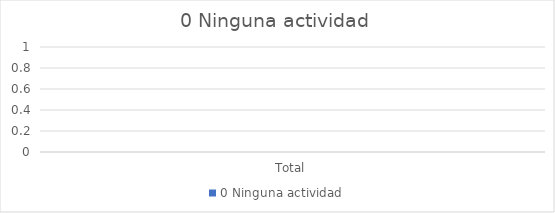
| Category | 0 |
|---|---|
| Total | 0 |